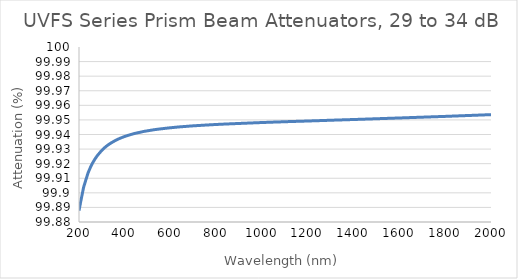
| Category | UVFS Series Prism Beam Attenuators, 29 to 34 dB |
|---|---|
| 200.0 | 99.888 |
| 210.0 | 99.896 |
| 220.0 | 99.904 |
| 230.0 | 99.909 |
| 240.0 | 99.914 |
| 250.0 | 99.918 |
| 260.0 | 99.921 |
| 270.0 | 99.923 |
| 280.0 | 99.926 |
| 290.0 | 99.927 |
| 300.0 | 99.929 |
| 310.0 | 99.931 |
| 320.0 | 99.932 |
| 330.0 | 99.933 |
| 340.0 | 99.934 |
| 350.0 | 99.935 |
| 360.0 | 99.936 |
| 370.0 | 99.937 |
| 380.0 | 99.937 |
| 390.0 | 99.938 |
| 400.0 | 99.939 |
| 410.0 | 99.939 |
| 420.0 | 99.94 |
| 430.0 | 99.94 |
| 440.0 | 99.941 |
| 450.0 | 99.941 |
| 460.0 | 99.941 |
| 470.0 | 99.942 |
| 480.0 | 99.942 |
| 490.0 | 99.942 |
| 500.0 | 99.943 |
| 510.0 | 99.943 |
| 520.0 | 99.943 |
| 530.0 | 99.943 |
| 540.0 | 99.944 |
| 550.0 | 99.944 |
| 560.0 | 99.944 |
| 570.0 | 99.944 |
| 580.0 | 99.944 |
| 590.0 | 99.944 |
| 600.0 | 99.945 |
| 610.0 | 99.945 |
| 620.0 | 99.945 |
| 630.0 | 99.945 |
| 640.0 | 99.945 |
| 650.0 | 99.945 |
| 660.0 | 99.945 |
| 670.0 | 99.946 |
| 680.0 | 99.946 |
| 690.0 | 99.946 |
| 700.0 | 99.946 |
| 710.0 | 99.946 |
| 720.0 | 99.946 |
| 730.0 | 99.946 |
| 740.0 | 99.946 |
| 750.0 | 99.946 |
| 760.0 | 99.947 |
| 770.0 | 99.947 |
| 780.0 | 99.947 |
| 790.0 | 99.947 |
| 800.0 | 99.947 |
| 810.0 | 99.947 |
| 820.0 | 99.947 |
| 830.0 | 99.947 |
| 840.0 | 99.947 |
| 850.0 | 99.947 |
| 860.0 | 99.947 |
| 870.0 | 99.947 |
| 880.0 | 99.947 |
| 890.0 | 99.948 |
| 900.0 | 99.948 |
| 910.0 | 99.948 |
| 920.0 | 99.948 |
| 930.0 | 99.948 |
| 940.0 | 99.948 |
| 950.0 | 99.948 |
| 960.0 | 99.948 |
| 970.0 | 99.948 |
| 980.0 | 99.948 |
| 990.0 | 99.948 |
| 1000.0 | 99.948 |
| 1010.0 | 99.948 |
| 1020.0 | 99.948 |
| 1030.0 | 99.948 |
| 1040.0 | 99.948 |
| 1050.0 | 99.948 |
| 1060.0 | 99.949 |
| 1070.0 | 99.949 |
| 1080.0 | 99.949 |
| 1090.0 | 99.949 |
| 1100.0 | 99.949 |
| 1110.0 | 99.949 |
| 1120.0 | 99.949 |
| 1130.0 | 99.949 |
| 1140.0 | 99.949 |
| 1150.0 | 99.949 |
| 1160.0 | 99.949 |
| 1170.0 | 99.949 |
| 1180.0 | 99.949 |
| 1190.0 | 99.949 |
| 1200.0 | 99.949 |
| 1210.0 | 99.949 |
| 1220.0 | 99.949 |
| 1230.0 | 99.949 |
| 1240.0 | 99.949 |
| 1250.0 | 99.95 |
| 1260.0 | 99.95 |
| 1270.0 | 99.95 |
| 1280.0 | 99.95 |
| 1290.0 | 99.95 |
| 1300.0 | 99.95 |
| 1310.0 | 99.95 |
| 1320.0 | 99.95 |
| 1330.0 | 99.95 |
| 1340.0 | 99.95 |
| 1350.0 | 99.95 |
| 1360.0 | 99.95 |
| 1370.0 | 99.95 |
| 1380.0 | 99.95 |
| 1390.0 | 99.95 |
| 1400.0 | 99.95 |
| 1410.0 | 99.95 |
| 1420.0 | 99.95 |
| 1430.0 | 99.95 |
| 1440.0 | 99.95 |
| 1450.0 | 99.951 |
| 1460.0 | 99.951 |
| 1470.0 | 99.951 |
| 1480.0 | 99.951 |
| 1490.0 | 99.951 |
| 1500.0 | 99.951 |
| 1510.0 | 99.951 |
| 1520.0 | 99.951 |
| 1530.0 | 99.951 |
| 1540.0 | 99.951 |
| 1550.0 | 99.951 |
| 1560.0 | 99.951 |
| 1570.0 | 99.951 |
| 1580.0 | 99.951 |
| 1590.0 | 99.951 |
| 1600.0 | 99.951 |
| 1610.0 | 99.951 |
| 1620.0 | 99.951 |
| 1630.0 | 99.952 |
| 1640.0 | 99.952 |
| 1650.0 | 99.952 |
| 1660.0 | 99.952 |
| 1670.0 | 99.952 |
| 1680.0 | 99.952 |
| 1690.0 | 99.952 |
| 1700.0 | 99.952 |
| 1710.0 | 99.952 |
| 1720.0 | 99.952 |
| 1730.0 | 99.952 |
| 1740.0 | 99.952 |
| 1750.0 | 99.952 |
| 1760.0 | 99.952 |
| 1770.0 | 99.952 |
| 1780.0 | 99.952 |
| 1790.0 | 99.952 |
| 1800.0 | 99.952 |
| 1810.0 | 99.952 |
| 1820.0 | 99.953 |
| 1830.0 | 99.953 |
| 1840.0 | 99.953 |
| 1850.0 | 99.953 |
| 1860.0 | 99.953 |
| 1870.0 | 99.953 |
| 1880.0 | 99.953 |
| 1890.0 | 99.953 |
| 1900.0 | 99.953 |
| 1910.0 | 99.953 |
| 1920.0 | 99.953 |
| 1930.0 | 99.953 |
| 1940.0 | 99.953 |
| 1950.0 | 99.953 |
| 1960.0 | 99.953 |
| 1970.0 | 99.953 |
| 1980.0 | 99.954 |
| 1990.0 | 99.954 |
| 2000.0 | 99.954 |